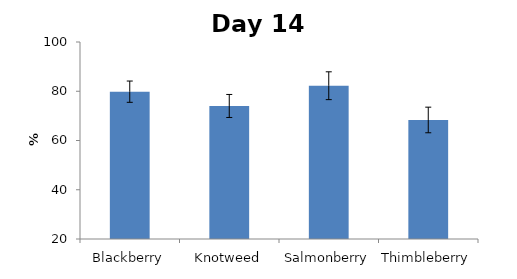
| Category | Series 0 |
|---|---|
| Blackberry | 79.825 |
| Knotweed | 74.023 |
| Salmonberry | 82.247 |
| Thimbleberry | 68.337 |